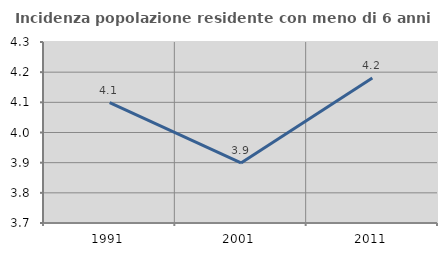
| Category | Incidenza popolazione residente con meno di 6 anni |
|---|---|
| 1991.0 | 4.099 |
| 2001.0 | 3.899 |
| 2011.0 | 4.181 |